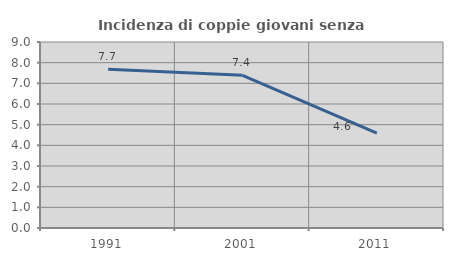
| Category | Incidenza di coppie giovani senza figli |
|---|---|
| 1991.0 | 7.676 |
| 2001.0 | 7.387 |
| 2011.0 | 4.585 |